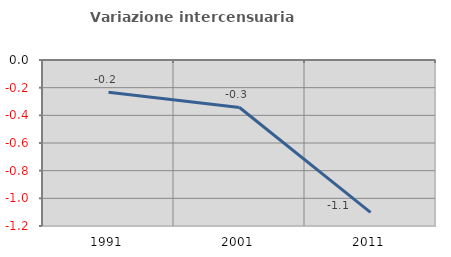
| Category | Variazione intercensuaria annua |
|---|---|
| 1991.0 | -0.233 |
| 2001.0 | -0.343 |
| 2011.0 | -1.102 |